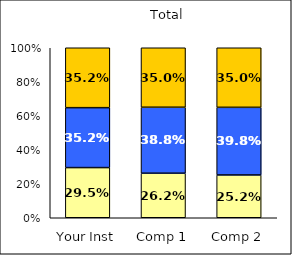
| Category | Low Satisfaction with Coursework | Average Satisfaction with Coursework | High Satisfaction with Coursework |
|---|---|---|---|
| Your Inst | 0.295 | 0.352 | 0.352 |
| Comp 1 | 0.262 | 0.388 | 0.35 |
| Comp 2 | 0.252 | 0.398 | 0.35 |